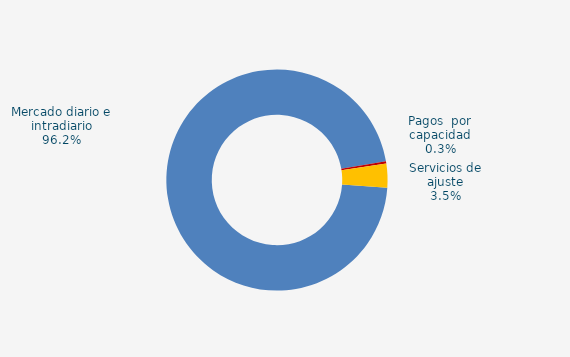
| Category | Series 0 |
|---|---|
| Mercado diario e intradiario | 83.91 |
| Pagos  por capacidad | 0.3 |
| Servicio interrumpibilidad | 0 |
| Servicios de ajuste | 3.05 |